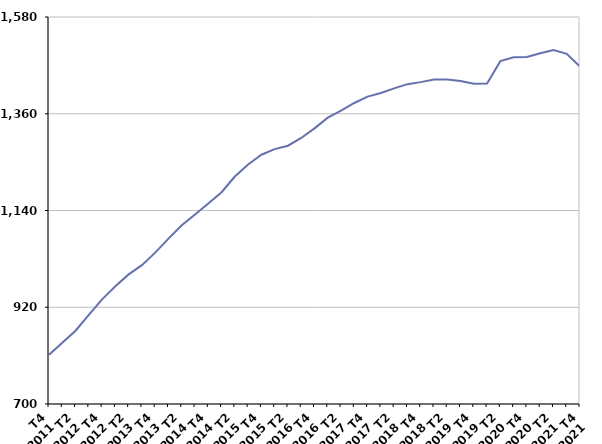
| Category | 50 ans ou plus |
|---|---|
| T4
2011 | 812 |
| T1
2012 | 839.4 |
| T2
2012 | 866.6 |
| T3
2012 | 902.8 |
| T4
2012 | 938 |
| T1
2013 | 967.7 |
| T2
2013 | 994.7 |
| T3
2013 | 1015.7 |
| T4
2013 | 1044.2 |
| T1
2014 | 1076.1 |
| T2
2014 | 1106.4 |
| T3
2014 | 1131 |
| T4
2014 | 1155.8 |
| T1
2015 | 1181.6 |
| T2
2015 | 1217.3 |
| T3
2015 | 1244.8 |
| T4
2015 | 1266.8 |
| T1
2016 | 1279.5 |
| T2
2016 | 1287.3 |
| T3
2016 | 1305 |
| T4
2016 | 1326.8 |
| T1
2017 | 1351.1 |
| T2
2017 | 1367.3 |
| T3
2017 | 1384.5 |
| T4
2017 | 1399 |
| T1
2018 | 1407.3 |
| T2
2018 | 1417.8 |
| T3
2018 | 1427.3 |
| T4
2018 | 1431.9 |
| T1
2019 | 1437.7 |
| T2
2019 | 1437.8 |
| T3
2019 | 1434.3 |
| T4
2019 | 1428.1 |
| T1
2020 | 1428.6 |
| T2
2020 | 1479.6 |
| T3
2020 | 1488.3 |
| T4
2020 | 1489.2 |
| T1
2021 | 1497.4 |
| T2
2021 | 1504.7 |
| T3
2021 | 1496.1 |
| T4
2021 | 1467.5 |